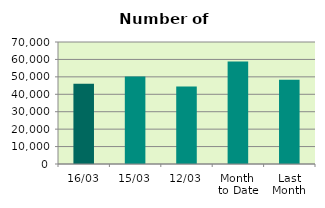
| Category | Series 0 |
|---|---|
| 16/03 | 46064 |
| 15/03 | 50174 |
| 12/03 | 44410 |
| Month 
to Date | 58781.667 |
| Last
Month | 48363.3 |